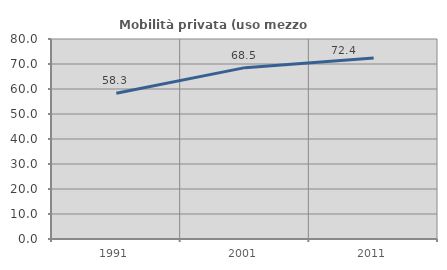
| Category | Mobilità privata (uso mezzo privato) |
|---|---|
| 1991.0 | 58.309 |
| 2001.0 | 68.542 |
| 2011.0 | 72.412 |